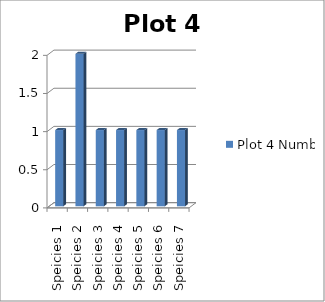
| Category | Plot 4 Number |
|---|---|
| Speicies 1 | 1 |
| Speicies 2 | 2 |
| Speicies 3 | 1 |
| Speicies 4 | 1 |
| Speicies 5 | 1 |
| Speicies 6 | 1 |
| Speicies 7 | 1 |